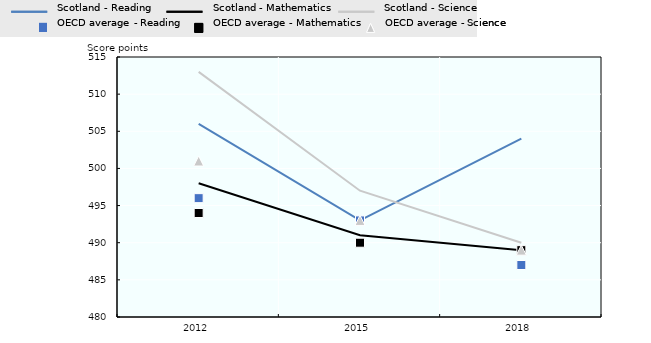
| Category | Scotland - Reading | Scotland - Mathematics | Scotland - Science | OECD average - Reading | OECD average - Mathematics | OECD average - Science |
|---|---|---|---|---|---|---|
| 2012 | 506 | 498 | 513 | 496 | 494 | 501 |
| 2015 | 493 | 491 | 497 | 493 | 490 | 493 |
| 2018 | 504 | 489 | 490 | 487 | 489 | 489 |